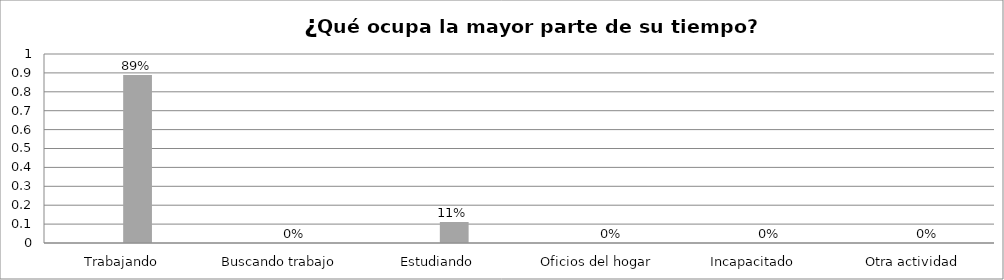
| Category | Series 0 | Series 1 | Series 2 | Series 3 |
|---|---|---|---|---|
| Trabajando |  |  | 0.889 |  |
| Buscando trabajo |  |  | 0 |  |
| Estudiando |  |  | 0.111 |  |
| Oficios del hogar |  |  | 0 |  |
| Incapacitado  |  |  | 0 |  |
| Otra actividad |  |  | 0 |  |